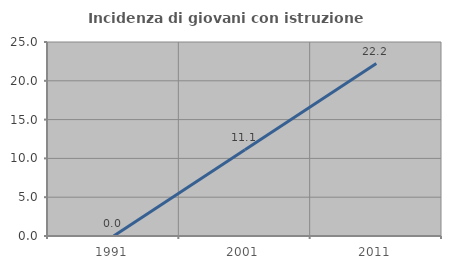
| Category | Incidenza di giovani con istruzione universitaria |
|---|---|
| 1991.0 | 0 |
| 2001.0 | 11.111 |
| 2011.0 | 22.222 |